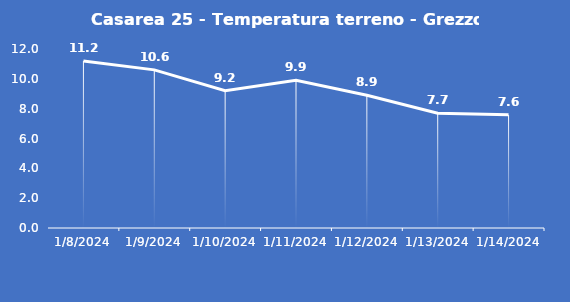
| Category | Casarea 25 - Temperatura terreno - Grezzo (°C) |
|---|---|
| 1/8/24 | 11.2 |
| 1/9/24 | 10.6 |
| 1/10/24 | 9.2 |
| 1/11/24 | 9.9 |
| 1/12/24 | 8.9 |
| 1/13/24 | 7.7 |
| 1/14/24 | 7.6 |